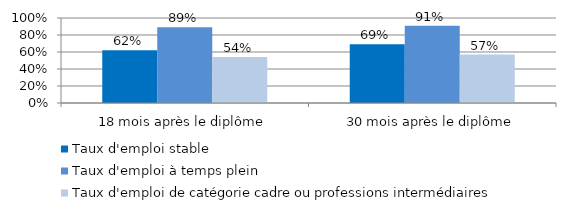
| Category | Taux d'emploi stable | Taux d'emploi à temps plein | Taux d'emploi de catégorie cadre ou professions intermédiaires |
|---|---|---|---|
| 18 mois après le diplôme | 0.62 | 0.89 | 0.54 |
| 30 mois après le diplôme | 0.69 | 0.91 | 0.57 |